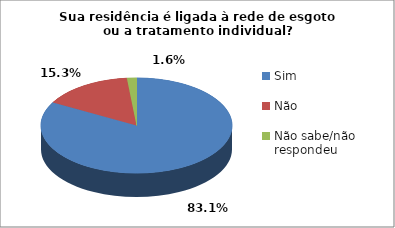
| Category | Series 0 |
|---|---|
| Sim | 103 |
| Não | 19 |
| Não sabe/não respondeu | 2 |